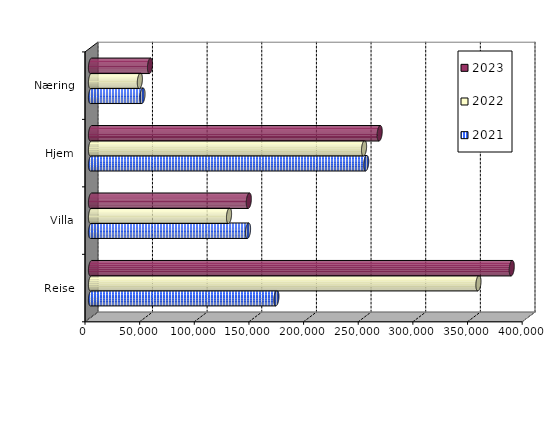
| Category | 2021 | 2022 | 2023 |
|---|---|---|---|
| Reise | 169642 | 354485 | 384965.436 |
| Villa | 143670.227 | 126288.325 | 144387.818 |
| Hjem | 251790 | 249832.072 | 264124.517 |
| Næring | 47091.596 | 44703.942 | 53986.423 |